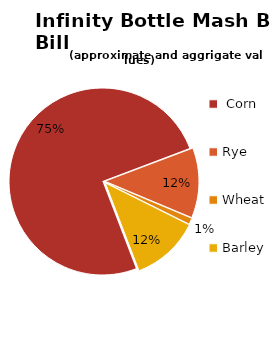
| Category | Series 0 |
|---|---|
|  Corn | 0.751 |
| Rye | 0.121 |
| Wheat | 0.01 |
| Barley | 0.118 |